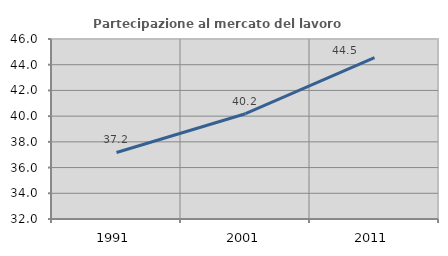
| Category | Partecipazione al mercato del lavoro  femminile |
|---|---|
| 1991.0 | 37.175 |
| 2001.0 | 40.186 |
| 2011.0 | 44.548 |